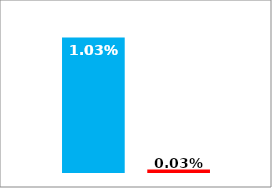
| Category | Dem | Rep |
|---|---|---|
| 0 | 0.01 | 0 |